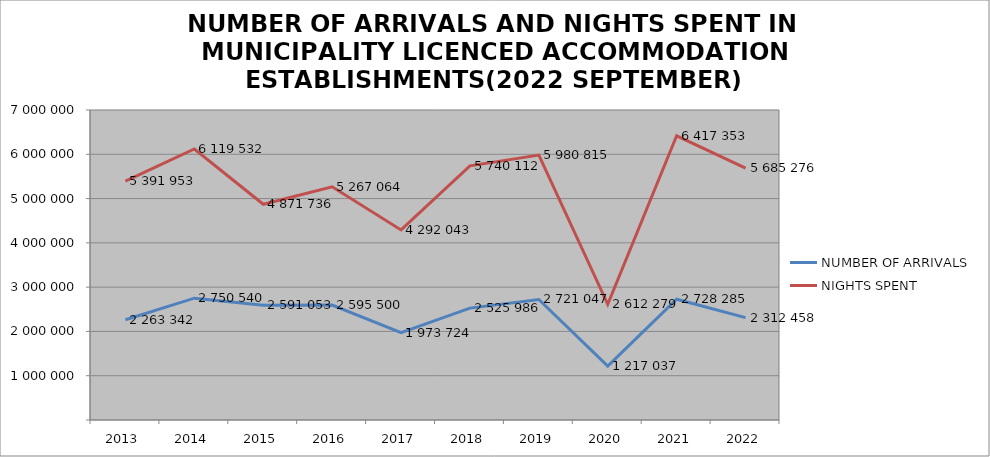
| Category | NUMBER OF ARRIVALS | NIGHTS SPENT |
|---|---|---|
| 2013 | 2263342 | 5391953 |
| 2014 | 2750540 | 6119532 |
| 2015 | 2591053 | 4871736 |
| 2016 | 2595500 | 5267064 |
| 2017 | 1973724 | 4292043 |
| 2018 | 2525986 | 5740112 |
| 2019 | 2721047 | 5980815 |
| 2020 | 1217037 | 2612279 |
| 2021 | 2728285 | 6417353 |
| 2022 | 2312458 | 5685276 |